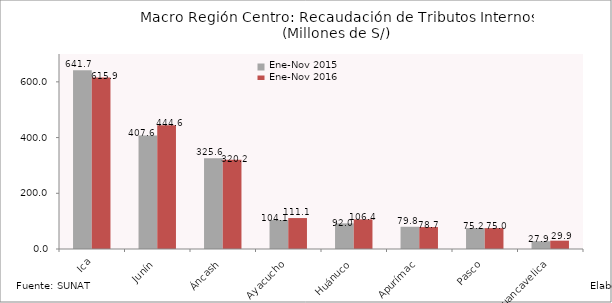
| Category | Ene-Nov 2015 | Ene-Nov 2016 |
|---|---|---|
| Ica | 641.702 | 615.939 |
| Junín | 407.571 | 444.566 |
| Áncash | 325.613 | 320.199 |
| Ayacucho | 104.068 | 111.07 |
| Huánuco | 92.037 | 106.358 |
| Apurímac | 79.752 | 78.728 |
| Pasco | 75.249 | 74.969 |
| Huancavelica | 27.87 | 29.882 |